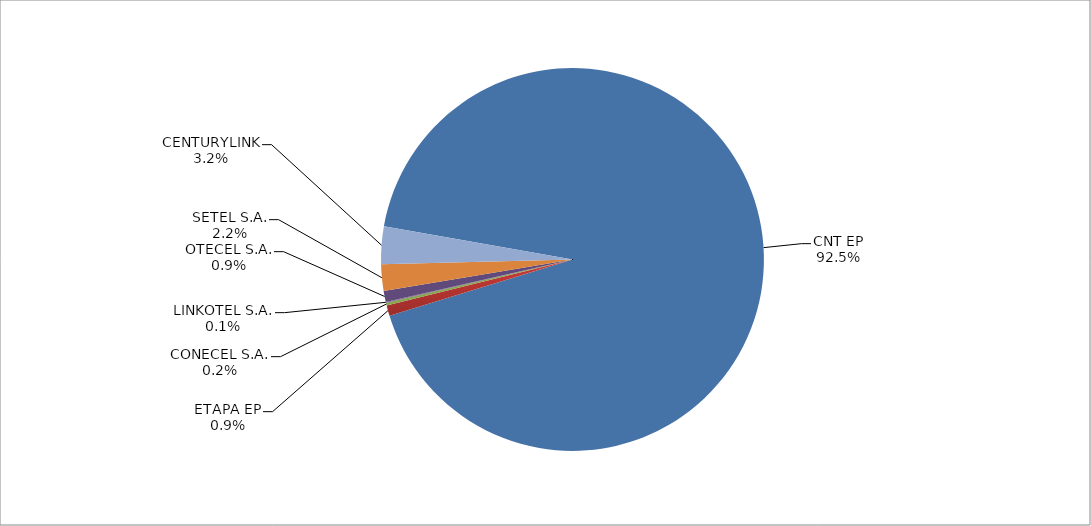
| Category | Series 0 |
|---|---|
| CNT EP | 2702 |
| ETAPA EP | 26 |
| CONECEL S.A. | 7 |
| LINKOTEL S.A. | 2 |
| OTECEL S.A. | 27 |
| SETEL S.A. | 65 |
| CENTURYLINK | 93 |